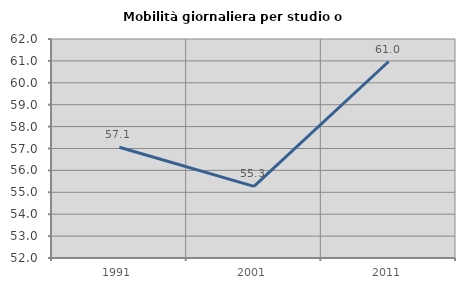
| Category | Mobilità giornaliera per studio o lavoro |
|---|---|
| 1991.0 | 57.058 |
| 2001.0 | 55.272 |
| 2011.0 | 60.972 |